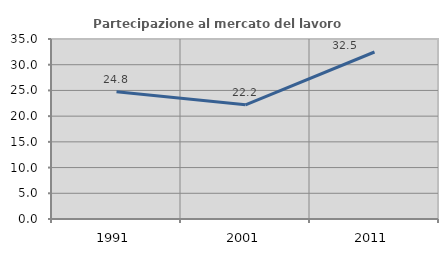
| Category | Partecipazione al mercato del lavoro  femminile |
|---|---|
| 1991.0 | 24.764 |
| 2001.0 | 22.195 |
| 2011.0 | 32.471 |